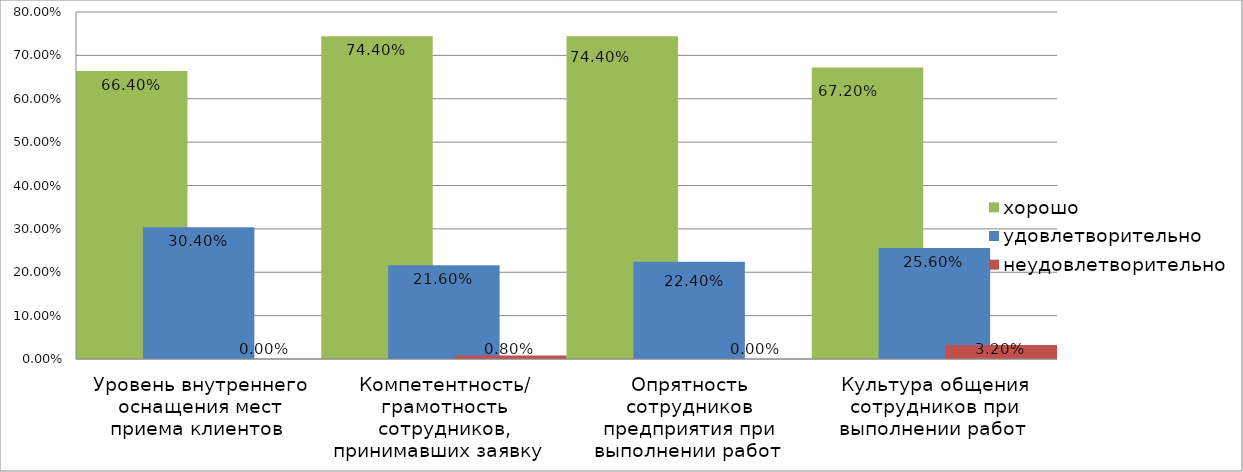
| Category | хорошо | удовлетворительно | неудовлетворительно |
|---|---|---|---|
| Уровень внутреннего оснащения мест приема клиентов  | 0.664 | 0.304 | 0 |
| Компетентность/ грамотность сотрудников, принимавших заявку   | 0.744 | 0.216 | 0.008 |
| Опрятность сотрудников предприятия при выполнении работ  | 0.744 | 0.224 | 0 |
| Культура общения сотрудников при выполнении работ  | 0.672 | 0.256 | 0.032 |